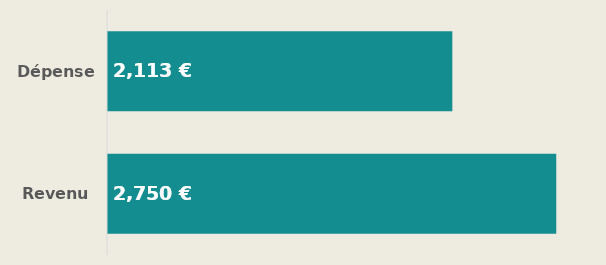
| Category | Revenu |
|---|---|
| Revenu | 2750 |
| Dépenses | 2112.5 |